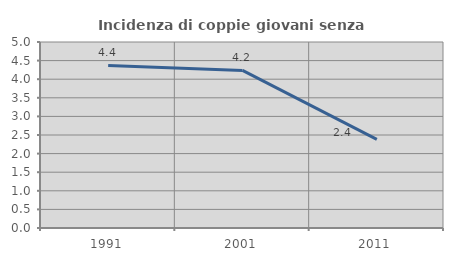
| Category | Incidenza di coppie giovani senza figli |
|---|---|
| 1991.0 | 4.37 |
| 2001.0 | 4.235 |
| 2011.0 | 2.381 |